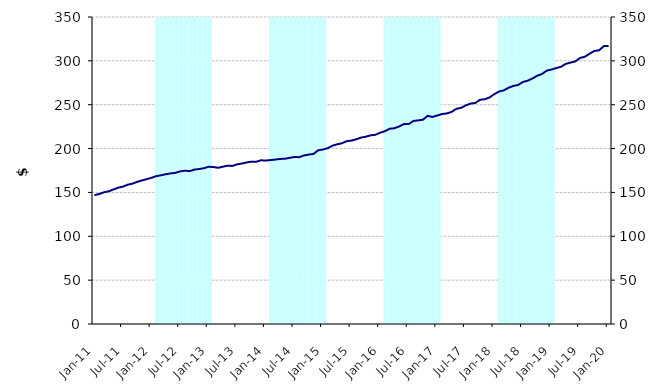
| Category | Series 1 |
|---|---|
| 0 | 0 |
| 1900-01-01 | 0 |
| 1900-01-02 | 0 |
| 1900-01-03 | 0 |
| 1900-01-04 | 0 |
| 1900-01-05 | 0 |
| 1900-01-06 | 0 |
| 1900-01-07 | 0 |
| 1900-01-08 | 0 |
| 1900-01-09 | 0 |
| 1900-01-10 | 0 |
| 1900-01-11 | 0 |
| 1900-01-12 | 0 |
| 1900-01-13 | 350000000 |
| 1900-01-14 | 350000000 |
| 1900-01-15 | 350000000 |
| 1900-01-16 | 350000000 |
| 1900-01-17 | 350000000 |
| 1900-01-18 | 350000000 |
| 1900-01-19 | 350000000 |
| 1900-01-20 | 350000000 |
| 1900-01-21 | 350000000 |
| 1900-01-22 | 350000000 |
| 1900-01-23 | 350000000 |
| 1900-01-24 | 350000000 |
| 1900-01-25 | 0 |
| 1900-01-26 | 0 |
| 1900-01-27 | 0 |
| 1900-01-28 | 0 |
| 1900-01-29 | 0 |
| 1900-01-30 | 0 |
| 1900-01-31 | 0 |
| 1900-02-01 | 0 |
| 1900-02-02 | 0 |
| 1900-02-03 | 0 |
| 1900-02-04 | 0 |
| 1900-02-05 | 0 |
| 1900-02-06 | 350000000 |
| 1900-02-07 | 350000000 |
| 1900-02-08 | 350000000 |
| 1900-02-09 | 350000000 |
| 1900-02-10 | 350000000 |
| 1900-02-11 | 350000000 |
| 1900-02-12 | 350000000 |
| 1900-02-13 | 350000000 |
| 1900-02-14 | 350000000 |
| 1900-02-15 | 350000000 |
| 1900-02-16 | 350000000 |
| 1900-02-17 | 350000000 |
| 1900-02-18 | 0 |
| 1900-02-19 | 0 |
| 1900-02-20 | 0 |
| 1900-02-21 | 0 |
| 1900-02-22 | 0 |
| 1900-02-23 | 0 |
| 1900-02-24 | 0 |
| 1900-02-25 | 0 |
| 1900-02-26 | 0 |
| 1900-02-27 | 0 |
| 1900-02-28 | 0 |
| 1900-02-28 | 0 |
| 1900-03-01 | 350000000 |
| 1900-03-02 | 350000000 |
| 1900-03-03 | 350000000 |
| 1900-03-04 | 350000000 |
| 1900-03-05 | 350000000 |
| 1900-03-06 | 350000000 |
| 1900-03-07 | 350000000 |
| 1900-03-08 | 350000000 |
| 1900-03-09 | 350000000 |
| 1900-03-10 | 350000000 |
| 1900-03-11 | 350000000 |
| 1900-03-12 | 350000000 |
| 1900-03-13 | 0 |
| 1900-03-14 | 0 |
| 1900-03-15 | 0 |
| 1900-03-16 | 0 |
| 1900-03-17 | 0 |
| 1900-03-18 | 0 |
| 1900-03-19 | 0 |
| 1900-03-20 | 0 |
| 1900-03-21 | 0 |
| 1900-03-22 | 0 |
| 1900-03-23 | 0 |
| 1900-03-24 | 0 |
| 1900-03-25 | 350000000 |
| 1900-03-26 | 350000000 |
| 1900-03-27 | 350000000 |
| 1900-03-28 | 350000000 |
| 1900-03-29 | 350000000 |
| 1900-03-30 | 350000000 |
| 1900-03-31 | 350000000 |
| 1900-04-01 | 350000000 |
| 1900-04-02 | 350000000 |
| 1900-04-03 | 350000000 |
| 1900-04-04 | 350000000 |
| 1900-04-05 | 350000000 |
| 1900-04-06 | 0 |
| 1900-04-07 | 0 |
| 1900-04-08 | 0 |
| 1900-04-09 | 0 |
| 1900-04-10 | 0 |
| 1900-04-11 | 0 |
| 1900-04-12 | 0 |
| 1900-04-13 | 0 |
| 1900-04-14 | 0 |
| 1900-04-15 | 0 |
| 1900-04-16 | 0 |
| 1900-04-17 | 0 |